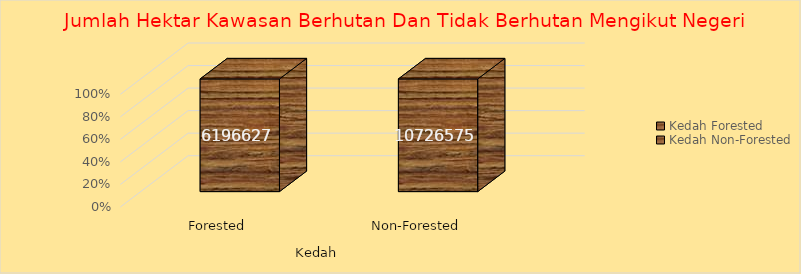
| Category | Total |
|---|---|
| 0 | 6196627 |
| 1 | 10726575 |